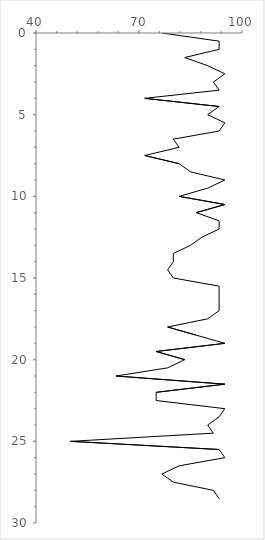
| Category | Series 0 |
|---|---|
| 76.66666666666667 | 0 |
| 93.33333333333333 | 0.5 |
| 93.33333333333333 | 1 |
| 83.33333333333334 | 1.5 |
| 90.0 | 2 |
| 95.0 | 2.5 |
| 91.66666666666667 | 3 |
| 93.33333333333333 | 3.5 |
| 71.66666666666666 | 4 |
| 93.33333333333333 | 4.5 |
| 90.0 | 5 |
| 95.0 | 5.5 |
| 93.33333333333333 | 6 |
| 80.0 | 6.5 |
| 81.66666666666666 | 7 |
| 71.66666666666666 | 7.5 |
| 81.66666666666666 | 8 |
| 85.0 | 8.5 |
| 95.0 | 9 |
| 90.0 | 9.5 |
| 81.66666666666666 | 10 |
| 95.0 | 10.5 |
| 86.66666666666667 | 11 |
| 93.33333333333333 | 11.5 |
| 93.33333333333333 | 12 |
| 88.33333333333333 | 12.5 |
| 85.0 | 13 |
| 80.0 | 13.5 |
| 80.0 | 14 |
| 78.33333333333333 | 14.5 |
| 80.0 | 15 |
| 93.33333333333333 | 15.5 |
| 93.33333333333333 | 16 |
| 93.33333333333333 | 16.5 |
| 93.33333333333333 | 17 |
| 90.0 | 17.5 |
| 78.33333333333333 | 18 |
| 86.66666666666667 | 18.5 |
| 95.0 | 19 |
| 75.0 | 19.5 |
| 83.33333333333334 | 20 |
| 78.33333333333333 | 20.5 |
| 63.33333333333333 | 21 |
| 95.0 | 21.5 |
| 75.0 | 22 |
| 75.0 | 22.5 |
| 95.0 | 23 |
| 93.33333333333333 | 23.5 |
| 90.0 | 24 |
| 91.66666666666667 | 24.5 |
| 50.0 | 25 |
| 93.33333333333333 | 25.5 |
| 95.0 | 26 |
| 81.66666666666666 | 26.5 |
| 76.66666666666667 | 27 |
| 80.0 | 27.5 |
| 91.66666666666667 | 28 |
| 93.33333333333333 | 28.5 |